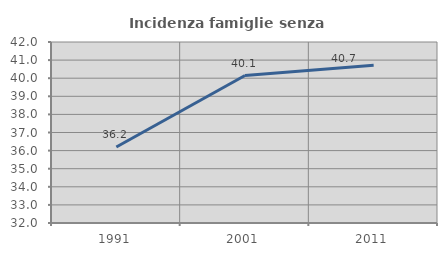
| Category | Incidenza famiglie senza nuclei |
|---|---|
| 1991.0 | 36.196 |
| 2001.0 | 40.148 |
| 2011.0 | 40.72 |